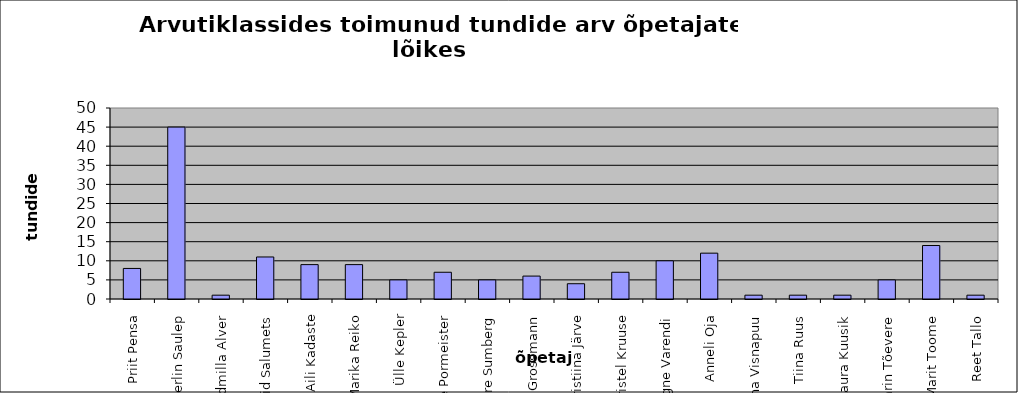
| Category | Series 0 |
|---|---|
| Priit Pensa | 8 |
| Merlin Saulep | 45 |
| Ludmilla Alver | 1 |
| Astrid Salumets | 11 |
| Aili Kadaste | 9 |
| Marika Reiko | 9 |
| Ülle Kepler | 5 |
| Sirje Pormeister | 7 |
| Kaire Sumberg | 5 |
| Riin Grossmann | 6 |
| Kristiina Järve | 4 |
| Kristel Kruuse | 7 |
| Signe Varendi | 10 |
| Anneli Oja | 12 |
| Riina Visnapuu | 1 |
| Tiina Ruus | 1 |
| Laura Kuusik | 1 |
| Karin Tõevere | 5 |
| Marit Toome | 14 |
| Reet Tallo | 1 |